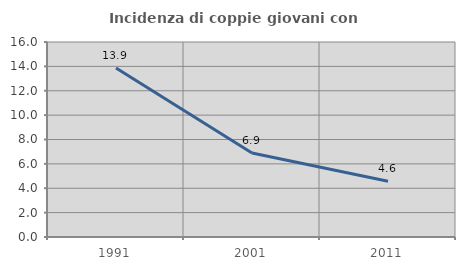
| Category | Incidenza di coppie giovani con figli |
|---|---|
| 1991.0 | 13.873 |
| 2001.0 | 6.886 |
| 2011.0 | 4.573 |